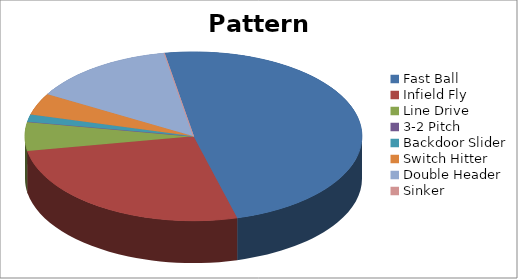
| Category | Pattern Distribution |
|---|---|
| Fast Ball | 35 |
| Infield Fly | 19 |
| Line Drive | 4 |
| 3-2 Pitch | 0 |
| Backdoor Slider | 1 |
| Switch Hitter | 3 |
| Double Header | 10 |
| Sinker | 0 |